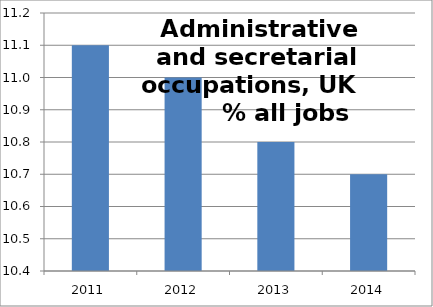
| Category | 4: Administrative & secretarial  |
|---|---|
| 2011.0 | 11.1 |
| 2012.0 | 11 |
| 2013.0 | 10.8 |
| 2014.0 | 10.7 |